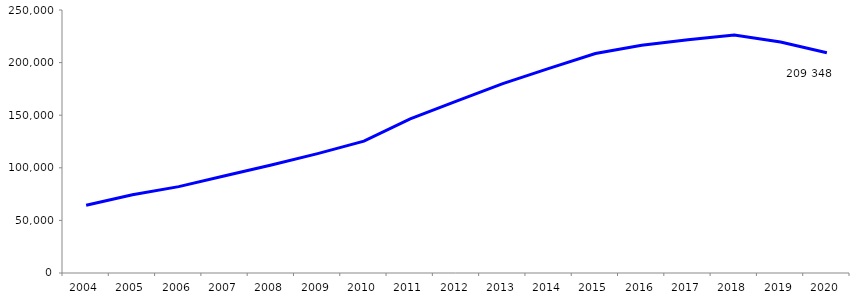
| Category | 2004 2005 2006 2007 2008 2009 2010 2011 2012 2013 2014 2015 2016 2017 2018 2019 2020 |
|---|---|
| 2004 | 64403 |
| 2005 | 74333 |
| 2006 | 82122 |
| 2007 | 92379 |
| 2008 | 102639 |
| 2009 | 113506 |
| 2010 | 125313 |
| 2011 | 146465 |
| 2012 | 163377 |
| 2013 | 180010 |
| 2014 | 194532 |
| 2015 | 208664 |
| 2016 | 216505 |
| 2017 | 221679 |
| 2018 | 226146 |
| 2019 | 219493 |
| 2020 | 209348 |